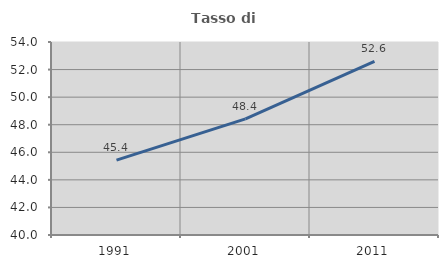
| Category | Tasso di occupazione   |
|---|---|
| 1991.0 | 45.436 |
| 2001.0 | 48.423 |
| 2011.0 | 52.602 |